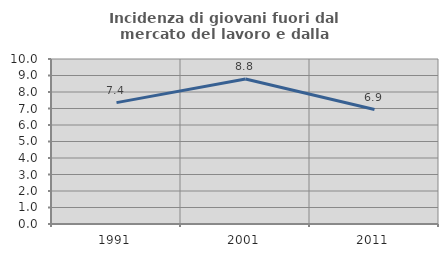
| Category | Incidenza di giovani fuori dal mercato del lavoro e dalla formazione  |
|---|---|
| 1991.0 | 7.355 |
| 2001.0 | 8.792 |
| 2011.0 | 6.936 |